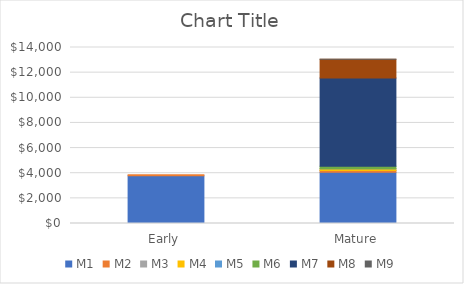
| Category | M1 | M2 | M3 | M4 | M5 | M6 | M7 | M8 | M9 |
|---|---|---|---|---|---|---|---|---|---|
| Early | 3794.061 | 79.5 | 0 | 0 | 0 | 0 | 0 | 0 | 0 |
| Mature | 4080.093 | 139.5 | 3.586 | 136.352 | 0.91 | 202.298 | 7005.758 | 1496.641 | 2.936 |